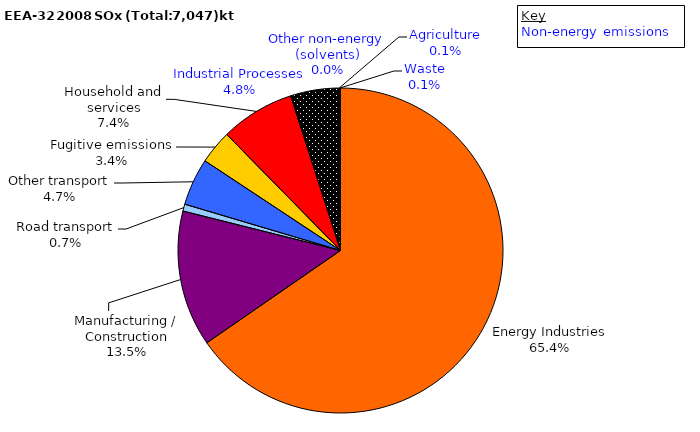
| Category | Series 0 |
|---|---|
| Energy Industries | 4600.408 |
| Manufacturing / Construction | 951.962 |
| Road transport | 48.747 |
| Other transport | 330.777 |
| Fugitive emissions | 235.962 |
| Household and services | 519.889 |
| Industrial Processes | 338.162 |
| Other non-energy (solvents) | 0.2 |
| Agriculture | 4.001 |
| Waste | 6.508 |